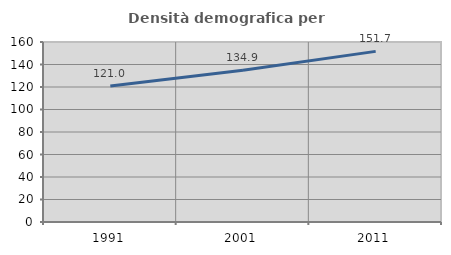
| Category | Densità demografica |
|---|---|
| 1991.0 | 120.967 |
| 2001.0 | 134.944 |
| 2011.0 | 151.676 |